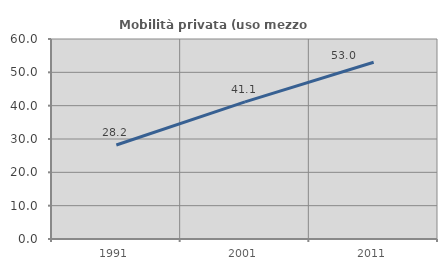
| Category | Mobilità privata (uso mezzo privato) |
|---|---|
| 1991.0 | 28.191 |
| 2001.0 | 41.135 |
| 2011.0 | 53.009 |